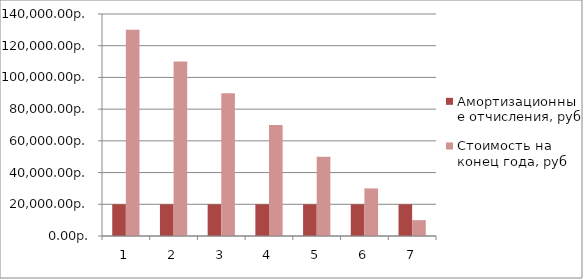
| Category | Амортизационные отчисления, руб | Стоимость на конец года, руб |
|---|---|---|
| 0 | 20000 | 130000 |
| 1 | 20000 | 110000 |
| 2 | 20000 | 90000 |
| 3 | 20000 | 70000 |
| 4 | 20000 | 50000 |
| 5 | 20000 | 30000 |
| 6 | 20000 | 10000 |